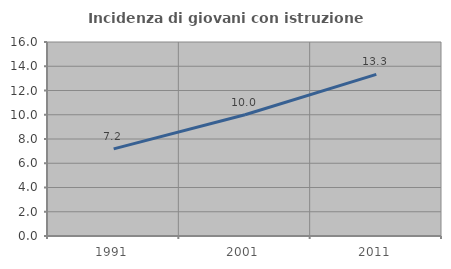
| Category | Incidenza di giovani con istruzione universitaria |
|---|---|
| 1991.0 | 7.186 |
| 2001.0 | 10 |
| 2011.0 | 13.333 |